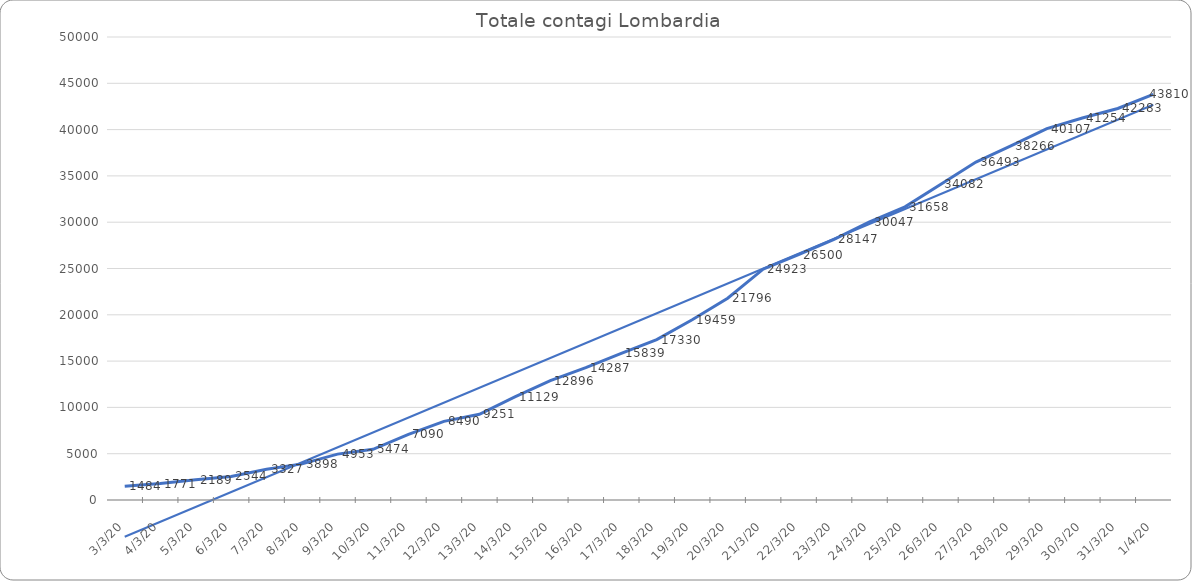
| Category | Series 0 |
|---|---|
| 2020-03-03 | 1484 |
| 2020-03-04 | 1771 |
| 2020-03-05 | 2189 |
| 2020-03-06 | 2544 |
| 2020-03-07 | 3327 |
| 2020-03-08 | 3898 |
| 2020-03-09 | 4953 |
| 2020-03-10 | 5474 |
| 2020-03-11 | 7090 |
| 2020-03-12 | 8490 |
| 2020-03-13 | 9251 |
| 2020-03-14 | 11129 |
| 2020-03-15 | 12896 |
| 2020-03-16 | 14287 |
| 2020-03-17 | 15839 |
| 2020-03-18 | 17330 |
| 2020-03-19 | 19459 |
| 2020-03-20 | 21796 |
| 2020-03-21 | 24923 |
| 2020-03-22 | 26500 |
| 2020-03-23 | 28147 |
| 2020-03-24 | 30047 |
| 2020-03-25 | 31658 |
| 2020-03-26 | 34082 |
| 2020-03-27 | 36493 |
| 2020-03-28 | 38266 |
| 2020-03-29 | 40107 |
| 2020-03-30 | 41254 |
| 2020-03-31 | 42283 |
| 2020-04-01 | 43810 |